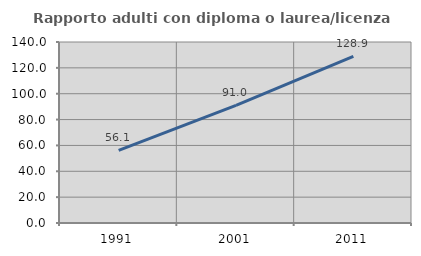
| Category | Rapporto adulti con diploma o laurea/licenza media  |
|---|---|
| 1991.0 | 56.125 |
| 2001.0 | 91.017 |
| 2011.0 | 128.94 |